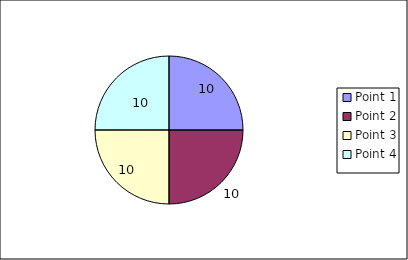
| Category | Series 1 |
|---|---|
| Point 1 | 10 |
| Point 2 | 10 |
| Point 3 | 10 |
| Point 4 | 10 |